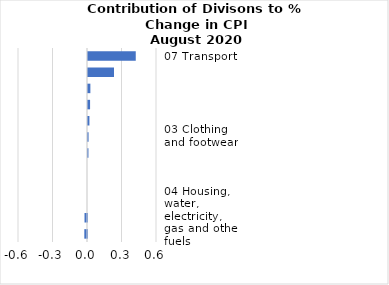
| Category |     Contributions |
|---|---|
| 07 Transport | 0.415 |
| 01 Food and non-alcoholic beverages | 0.226 |
| 02 Alcoholic beverages, tobacco and narcotics | 0.021 |
| 05 Furnishings, household equipment and routine household maintenance | 0.018 |
| 11 Restaurants and hotels | 0.012 |
| 03 Clothing and footwear | 0.005 |
| 09 Recreation and culture | 0.004 |
| 10 Education | 0 |
| 08 Communication | 0 |
| 06 Health | 0 |
| 04 Housing, water, electricity, gas and other fuels | -0.022 |
| 12 Miscellaneous goods and services | -0.023 |